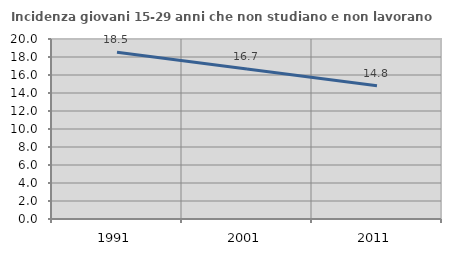
| Category | Incidenza giovani 15-29 anni che non studiano e non lavorano  |
|---|---|
| 1991.0 | 18.538 |
| 2001.0 | 16.667 |
| 2011.0 | 14.815 |